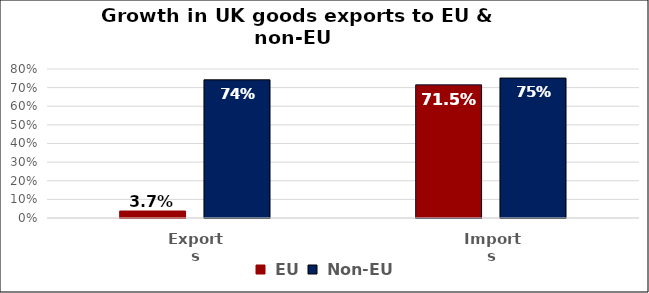
| Category |  EU |  Non-EU |
|---|---|---|
| Exports | 0.037 | 0.742 |
| Imports | 0.715 | 0.751 |